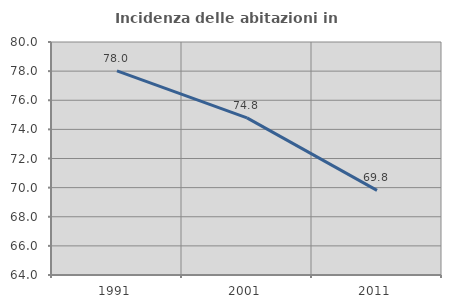
| Category | Incidenza delle abitazioni in proprietà  |
|---|---|
| 1991.0 | 78.019 |
| 2001.0 | 74.793 |
| 2011.0 | 69.815 |